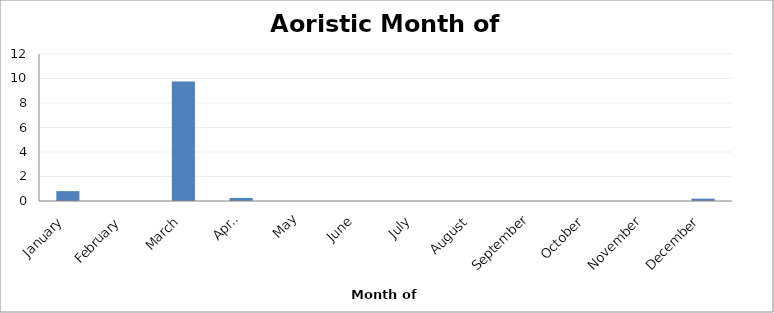
| Category | Month of Year |
|---|---|
| January | 0.805 |
| February | 0 |
| March | 9.75 |
| April | 0.25 |
| May | 0 |
| June | 0 |
| July | 0 |
| August | 0 |
| September | 0 |
| October | 0 |
| November | 0 |
| December | 0.195 |